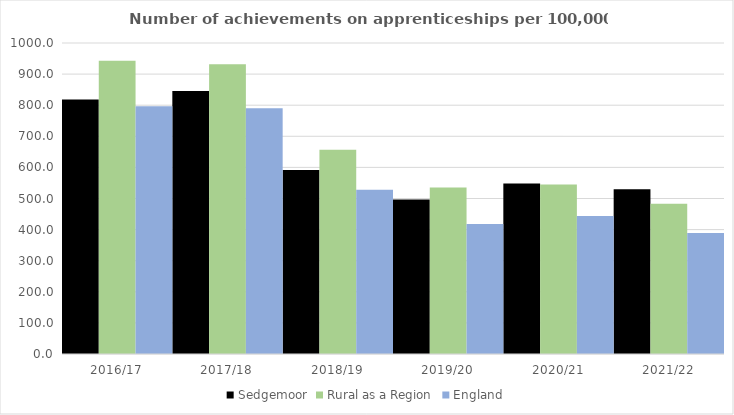
| Category | Sedgemoor | Rural as a Region | England |
|---|---|---|---|
| 2016/17 | 818 | 942.594 | 797 |
| 2017/18 | 846 | 931.709 | 790 |
| 2018/19 | 592 | 656.44 | 528 |
| 2019/20 | 497 | 535.552 | 418 |
| 2020/21 | 548 | 545.333 | 444 |
| 2021/22 | 530 | 482.936 | 389 |